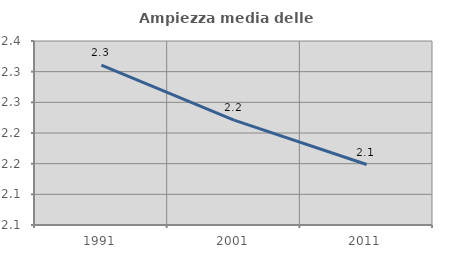
| Category | Ampiezza media delle famiglie |
|---|---|
| 1991.0 | 2.311 |
| 2001.0 | 2.221 |
| 2011.0 | 2.149 |